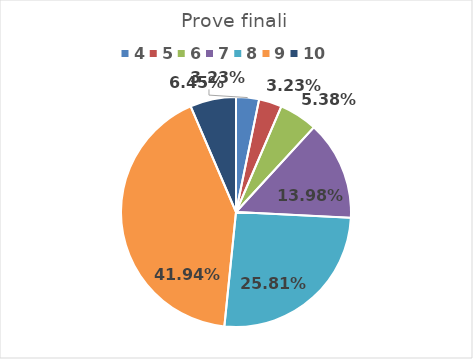
| Category | Series 0 |
|---|---|
| 4.0 | 0.032 |
| 5.0 | 0.032 |
| 6.0 | 0.054 |
| 7.0 | 0.14 |
| 8.0 | 0.258 |
| 9.0 | 0.419 |
| 10.0 | 0.065 |